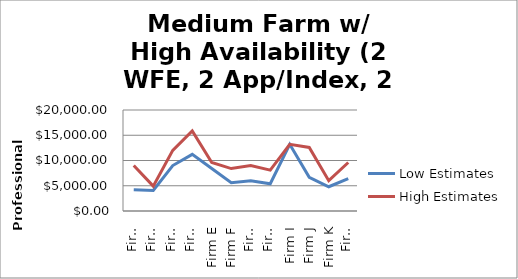
| Category | Low Estimates | High Estimates |
|---|---|---|
| Firm A | 4200 | 9000 |
| Firm B | 4080 | 4920 |
| Firm C | 9000 | 12000 |
| Firm D | 11220 | 15840 |
| Firm E | 8400 | 9600 |
| Firm F | 5600 | 8400 |
| Firm G | 6000 | 9000 |
| Firm H | 5400 | 8100 |
| Firm I | 13200 | 13200 |
| Firm J | 6660 | 12580 |
| Firm K | 4800 | 6000 |
| Firm M | 6400 | 9600 |